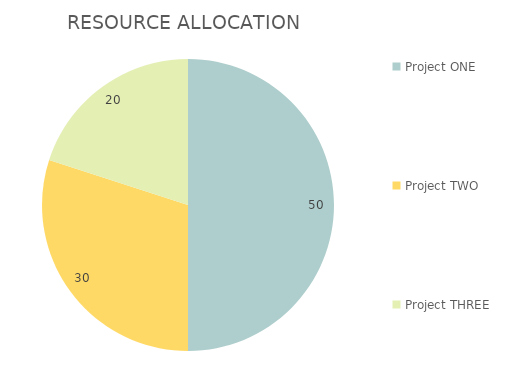
| Category | Series 0 |
|---|---|
| Project ONE | 50 |
| Project TWO | 30 |
| Project THREE | 20 |